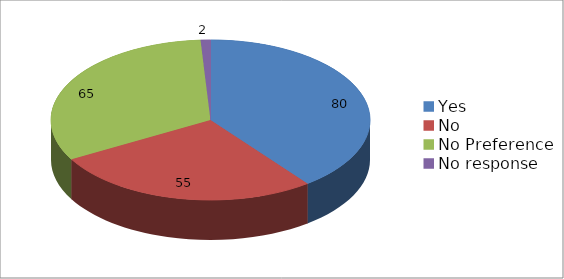
| Category | Series 0 |
|---|---|
| Yes | 80 |
| No | 55 |
| No Preference | 65 |
| No response | 2 |